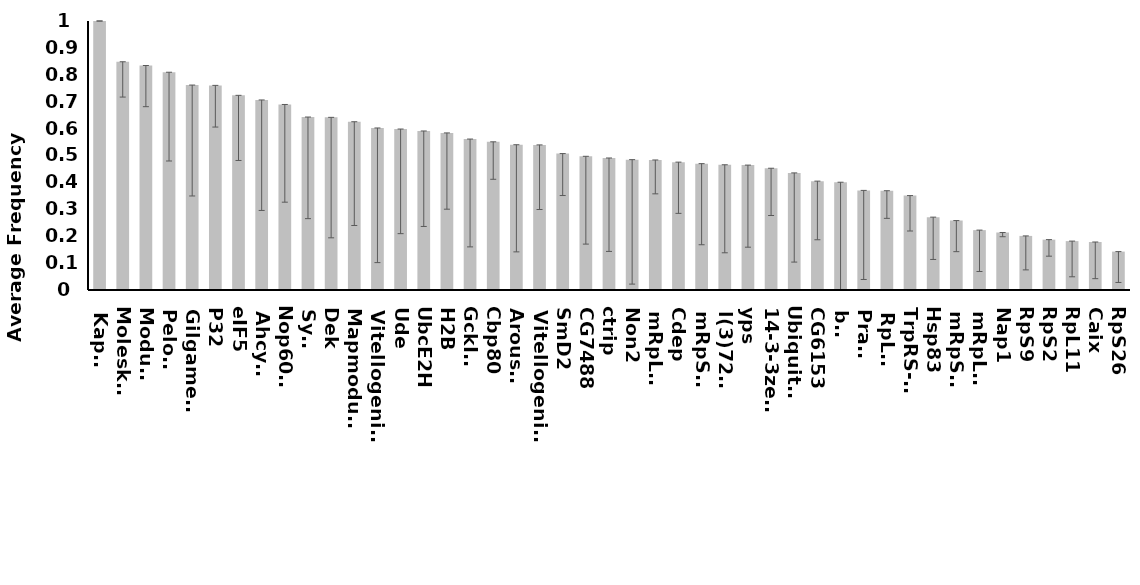
| Category | CidB* |
|---|---|
| KapA2 | 1 |
| Moleskin | 0.848 |
| Modulo | 0.835 |
| Pelota | 0.81 |
| Gilgamesh | 0.762 |
| P32 | 0.761 |
| eIF5 | 0.724 |
| AhcyL1 | 0.706 |
| Nop60B | 0.69 |
| Synj | 0.643 |
| Dek | 0.642 |
| Mapmodulin | 0.626 |
| Vitellogenin-1 | 0.602 |
| Ude | 0.598 |
| UbcE2H | 0.591 |
| H2B | 0.584 |
| GckIII | 0.561 |
| Cbp80 | 0.551 |
| Arouser | 0.54 |
| Vitellogenin-2 | 0.539 |
| SmD2 | 0.507 |
| CG7488 | 0.497 |
| ctrip | 0.491 |
| Non2 | 0.485 |
| mRpL37 | 0.483 |
| Cdep | 0.475 |
| mRpS22 | 0.47 |
| l(3)72Ab | 0.466 |
| yps | 0.464 |
| 14-3-3zeta | 0.453 |
| Ubiquitin | 0.435 |
| CG6153 | 0.405 |
| bsf | 0.401 |
| Prat2 | 0.37 |
| RpLP0 | 0.369 |
| TrpRS-m | 0.351 |
| Hsp83 | 0.271 |
| mRpS10 | 0.258 |
| mRpL12 | 0.223 |
| Nap1 | 0.214 |
| RpS9 | 0.201 |
| RpS2 | 0.187 |
| RpL11 | 0.182 |
| Caix | 0.178 |
| RpS26 | 0.143 |